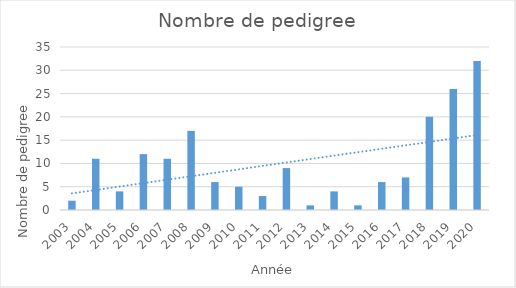
| Category | Series 0 |
|---|---|
| 2003.0 | 2 |
| 2004.0 | 11 |
| 2005.0 | 4 |
| 2006.0 | 12 |
| 2007.0 | 11 |
| 2008.0 | 17 |
| 2009.0 | 6 |
| 2010.0 | 5 |
| 2011.0 | 3 |
| 2012.0 | 9 |
| 2013.0 | 1 |
| 2014.0 | 4 |
| 2015.0 | 1 |
| 2016.0 | 6 |
| 2017.0 | 7 |
| 2018.0 | 20 |
| 2019.0 | 26 |
| 2020.0 | 32 |